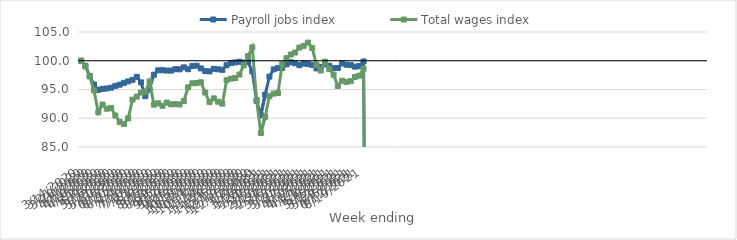
| Category | Payroll jobs index | Total wages index |
|---|---|---|
| 14/03/2020 | 100 | 100 |
| 21/03/2020 | 99.115 | 99.009 |
| 28/03/2020 | 97.35 | 97.267 |
| 04/04/2020 | 95.868 | 94.85 |
| 11/04/2020 | 94.934 | 91.031 |
| 18/04/2020 | 95.113 | 92.384 |
| 25/04/2020 | 95.179 | 91.651 |
| 02/05/2020 | 95.31 | 91.796 |
| 09/05/2020 | 95.62 | 90.48 |
| 16/05/2020 | 95.838 | 89.347 |
| 23/05/2020 | 96.16 | 89.002 |
| 30/05/2020 | 96.409 | 89.976 |
| 06/06/2020 | 96.681 | 93.234 |
| 13/06/2020 | 97.206 | 93.758 |
| 20/06/2020 | 96.234 | 94.483 |
| 27/06/2020 | 93.85 | 94.549 |
| 04/07/2020 | 95.031 | 96.371 |
| 11/07/2020 | 97.564 | 92.369 |
| 18/07/2020 | 98.334 | 92.604 |
| 25/07/2020 | 98.351 | 92.156 |
| 01/08/2020 | 98.295 | 92.718 |
| 08/08/2020 | 98.286 | 92.417 |
| 15/08/2020 | 98.532 | 92.458 |
| 22/08/2020 | 98.511 | 92.399 |
| 29/08/2020 | 98.856 | 93.002 |
| 05/09/2020 | 98.533 | 95.385 |
| 12/09/2020 | 99.092 | 96.077 |
| 19/09/2020 | 99.131 | 96.127 |
| 26/09/2020 | 98.663 | 96.251 |
| 03/10/2020 | 98.197 | 94.47 |
| 10/10/2020 | 98.147 | 92.801 |
| 17/10/2020 | 98.588 | 93.455 |
| 24/10/2020 | 98.51 | 92.872 |
| 31/10/2020 | 98.418 | 92.536 |
| 07/11/2020 | 99.217 | 96.618 |
| 14/11/2020 | 99.594 | 96.875 |
| 21/11/2020 | 99.705 | 96.999 |
| 28/11/2020 | 99.826 | 97.597 |
| 05/12/2020 | 99.681 | 99.216 |
| 12/12/2020 | 99.794 | 100.803 |
| 19/12/2020 | 98.145 | 102.316 |
| 26/12/2020 | 93.032 | 93.163 |
| 02/01/2021 | 90.537 | 87.438 |
| 09/01/2021 | 94.104 | 90.246 |
| 16/01/2021 | 97.245 | 93.824 |
| 23/01/2021 | 98.504 | 94.287 |
| 30/01/2021 | 98.75 | 94.386 |
| 06/02/2021 | 98.764 | 99.412 |
| 13/02/2021 | 99.369 | 100.448 |
| 20/02/2021 | 99.732 | 101.087 |
| 27/02/2021 | 99.568 | 101.423 |
| 06/03/2021 | 99.218 | 102.294 |
| 13/03/2021 | 99.511 | 102.589 |
| 20/03/2021 | 99.428 | 103.152 |
| 27/03/2021 | 99.289 | 102.229 |
| 03/04/2021 | 98.673 | 99.278 |
| 10/04/2021 | 98.936 | 98.301 |
| 17/04/2021 | 99.36 | 99.828 |
| 24/04/2021 | 99.124 | 98.56 |
| 01/05/2021 | 98.703 | 97.568 |
| 08/05/2021 | 98.752 | 95.619 |
| 15/05/2021 | 99.538 | 96.518 |
| 22/05/2021 | 99.309 | 96.317 |
| 29/05/2021 | 99.233 | 96.459 |
| 05/06/2021 | 98.975 | 97.193 |
| 12/06/2021 | 99.063 | 97.397 |
| 19/06/2021 | 99.873 | 98.618 |